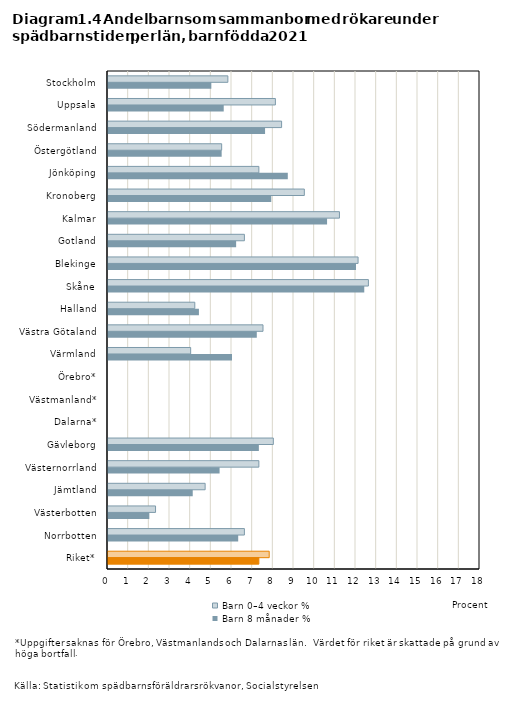
| Category | Barn 0–4 veckor % | Barn 8 månader % |
|---|---|---|
| Stockholm | 5.8 | 5 |
| Uppsala | 8.1 | 5.6 |
| Södermanland | 8.4 | 7.6 |
| Östergötland | 5.5 | 5.5 |
| Jönköping | 7.3 | 8.7 |
| Kronoberg | 9.5 | 7.9 |
| Kalmar | 11.2 | 10.6 |
| Gotland | 6.6 | 6.2 |
| Blekinge | 12.1 | 12 |
| Skåne | 12.6 | 12.4 |
| Halland | 4.2 | 4.4 |
| Västra Götaland | 7.5 | 7.2 |
| Värmland | 4 | 6 |
| Örebro* | 0 | 0 |
| Västmanland* | 0 | 0 |
| Dalarna* | 0 | 0 |
| Gävleborg | 8 | 7.3 |
| Västernorrland | 7.3 | 5.4 |
| Jämtland | 4.7 | 4.1 |
| Västerbotten | 2.3 | 2 |
| Norrbotten | 6.6 | 6.3 |
| Riket* | 7.8 | 7.3 |